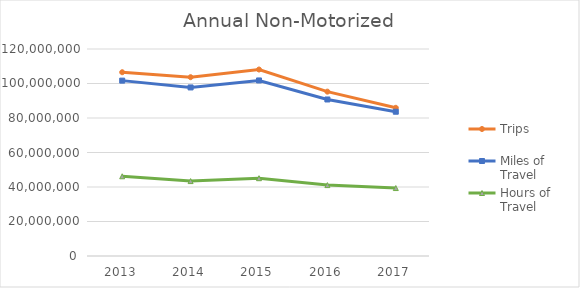
| Category | Trips | Miles of Travel | Hours of Travel |
|---|---|---|---|
| 2013 | 106532018.796 | 101666008.116 | 46219092.357 |
| 2014 | 103654189.409 | 97715396.286 | 43426907.918 |
| 2015 | 108110104.177 | 101767940.973 | 45103951.513 |
| 2016 | 95277160.205 | 90740227.919 | 41099007.341 |
| 2017 | 85909584.969 | 83639289.782 | 39391865.851 |